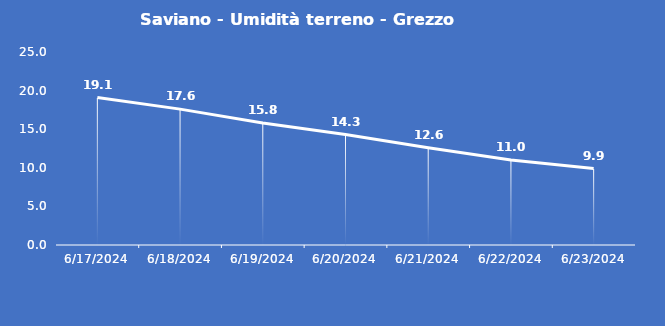
| Category | Saviano - Umidità terreno - Grezzo (%VWC) |
|---|---|
| 6/17/24 | 19.1 |
| 6/18/24 | 17.6 |
| 6/19/24 | 15.8 |
| 6/20/24 | 14.3 |
| 6/21/24 | 12.6 |
| 6/22/24 | 11 |
| 6/23/24 | 9.9 |